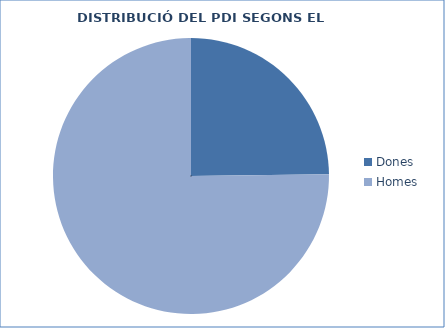
| Category | Series 0 |
|---|---|
| Dones | 659 |
| Homes | 1997 |